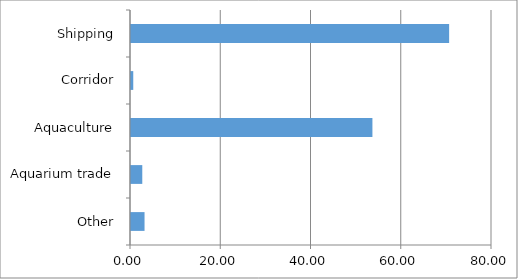
| Category | Series 0 |
|---|---|
| Other | 3 |
| Aquarium trade | 2.5 |
| Aquaculture | 53.5 |
| Corridor | 0.5 |
| Shipping | 70.5 |